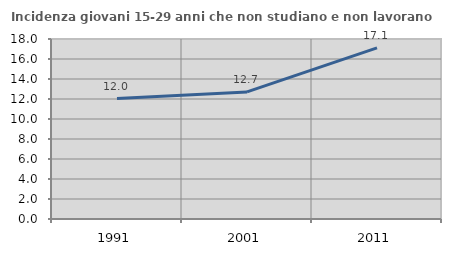
| Category | Incidenza giovani 15-29 anni che non studiano e non lavorano  |
|---|---|
| 1991.0 | 12.038 |
| 2001.0 | 12.707 |
| 2011.0 | 17.117 |